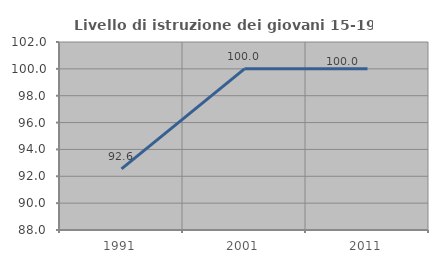
| Category | Livello di istruzione dei giovani 15-19 anni |
|---|---|
| 1991.0 | 92.553 |
| 2001.0 | 100 |
| 2011.0 | 100 |